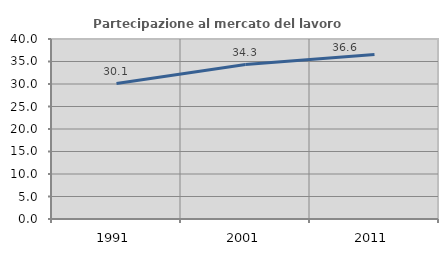
| Category | Partecipazione al mercato del lavoro  femminile |
|---|---|
| 1991.0 | 30.111 |
| 2001.0 | 34.324 |
| 2011.0 | 36.565 |